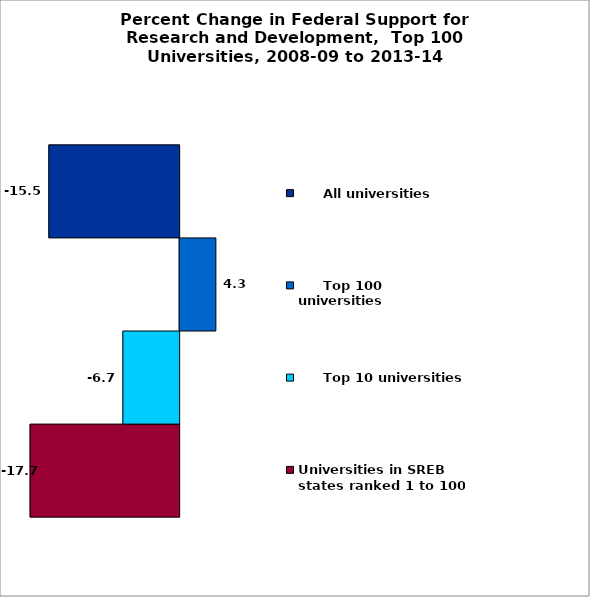
| Category | Universities in SREB states ranked 1 to 100 |      Top 10 universities |      Top 100 universities |      All universities |
|---|---|---|---|---|
| 0 | -17.675 | -6.677 | 4.292 | -15.452 |